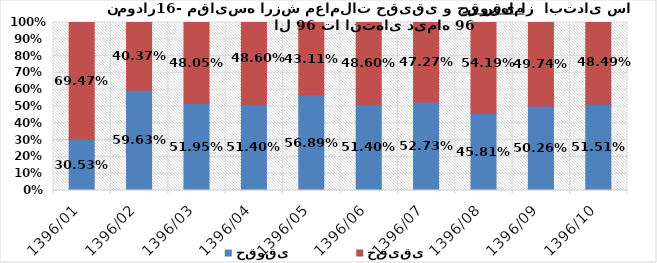
| Category | حقوقی | حقیقی |
|---|---|---|
| 1396/01 | 0.305 | 0.695 |
| 1396/02 | 0.596 | 0.404 |
| 1396/03 | 0.52 | 0.48 |
| 1396/04 | 0.514 | 0.486 |
| 1396/05 | 0.569 | 0.431 |
| 1396/06 | 0.514 | 0.486 |
| 1396/07 | 0.527 | 0.473 |
| 1396/08 | 0.458 | 0.542 |
| 1396/09 | 0.503 | 0.497 |
| 1396/10 | 0.515 | 0.485 |